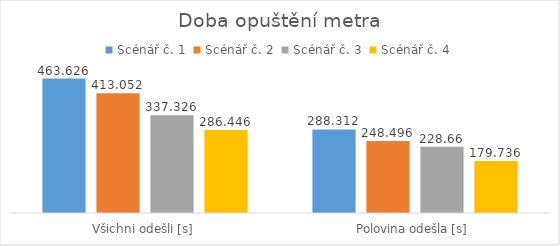
| Category | Scénář č. 1 | Scénář č. 2 | Scénář č. 3 | Scénář č. 4 |
|---|---|---|---|---|
| Všichni odešli [s] | 463.626 | 413.052 | 337.326 | 286.446 |
| Polovina odešla [s] | 288.312 | 248.496 | 228.66 | 179.736 |